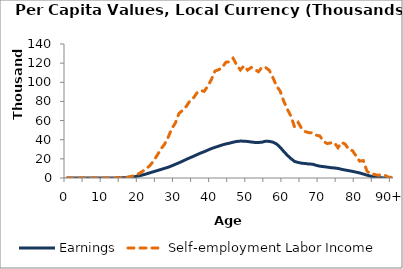
| Category | Earnings | Self-employment Labor Income |
|---|---|---|
| 0 | 0 | 0 |
|  | 0 | 0 |
| 2 | 0 | 2.196 |
| 3 | 0 | 7.668 |
| 4 | 0 | 10.244 |
| 5 | 3.633 | 10.635 |
| 6 | 19.472 | 10.639 |
| 7 | 33.149 | 15.727 |
| 8 | 51.43 | 34.352 |
| 9 | 68.74 | 34.644 |
| 10 | 88.912 | 48.315 |
| 11 | 94.048 | 51.306 |
| 12 | 100.895 | 100.796 |
| 13 | 105.341 | 147.845 |
| 14 | 140.071 | 240.759 |
| 15 | 231.315 | 452.625 |
| 16 | 371.399 | 544.231 |
| 17 | 632.576 | 1051.059 |
| 18 | 1014.146 | 1790.759 |
| 19 | 1561.061 | 3351.807 |
| 20 | 2254.077 | 4609.606 |
| 21 | 3216.134 | 7127.478 |
| 22 | 4267.357 | 9740.834 |
| 23 | 5432.72 | 13059.377 |
| 24 | 6613.111 | 17872.442 |
| 25 | 7723.946 | 23676.517 |
| 26 | 8873.879 | 30277.675 |
| 27 | 10018.509 | 35062.132 |
| 28 | 11186.316 | 42176.163 |
| 29 | 12666.139 | 51417.719 |
| 30 | 14269.557 | 57221.198 |
| 31 | 15842.481 | 67246.19 |
| 32 | 17530.158 | 70707.167 |
| 33 | 19362.333 | 74622.965 |
| 34 | 21020.798 | 80254.978 |
| 35 | 22632.268 | 83481.888 |
| 36 | 24357.529 | 88966.593 |
| 37 | 26019.777 | 91389.103 |
| 38 | 27493.982 | 90552.496 |
| 39 | 29127.593 | 95983.369 |
| 40 | 30726.801 | 102957.934 |
| 41 | 32053.293 | 111792.183 |
| 42 | 33298.215 | 113101.061 |
| 43 | 34533.437 | 115450.928 |
| 44 | 35593.271 | 120972.042 |
| 45 | 36384.095 | 121447.104 |
| 46 | 37398.421 | 125129.472 |
| 47 | 38176.925 | 117849.287 |
| 48 | 38548.085 | 112852.436 |
| 49 | 38505.279 | 117124.293 |
| 50 | 38167.499 | 112699.556 |
| 51 | 37631.735 | 115531.377 |
| 52 | 37164.532 | 113450.488 |
| 53 | 37120.393 | 111000.255 |
| 54 | 37414.966 | 115831.264 |
| 55 | 38490.432 | 115398.875 |
| 56 | 38251.835 | 112540.281 |
| 57 | 37498.579 | 104996.091 |
| 58 | 35566.249 | 96113.606 |
| 59 | 32129.304 | 90892.454 |
| 60 | 27724.548 | 80257.789 |
| 61 | 23726.139 | 71895.243 |
| 62 | 20247.207 | 64423.893 |
| 63 | 17307.041 | 53266.586 |
| 64 | 16219.071 | 57989.392 |
| 65 | 15438.428 | 51468.242 |
| 66 | 15102.554 | 48372.296 |
| 67 | 14595.041 | 47386.08 |
| 68 | 14436.533 | 47164.733 |
| 69 | 13153.19 | 44729.49 |
| 70 | 12362.093 | 43902.54 |
| 71 | 11861.705 | 38192.979 |
| 72 | 11379.241 | 36003.22 |
| 73 | 10830.846 | 36677.384 |
| 74 | 10490.463 | 37027.977 |
| 75 | 10007.691 | 31639.99 |
| 76 | 9092.866 | 37202.937 |
| 77 | 8310.357 | 35361.486 |
| 78 | 7671.467 | 29641.462 |
| 79 | 6942.246 | 28662.213 |
| 80 | 6109.844 | 23068.479 |
| 81 | 5293.19 | 17572.072 |
| 82 | 4154.064 | 18212.394 |
| 83 | 3039.21 | 7390.325 |
| 84 | 1972.003 | 4255.62 |
| 85 | 927.698 | 3948.357 |
| 86 | 466.635 | 2866.013 |
| 87 | 197.306 | 3371.966 |
| 88 | 48.585 | 2791.486 |
| 89 | 0 | 795.371 |
| 90+ | 0 | 756.686 |